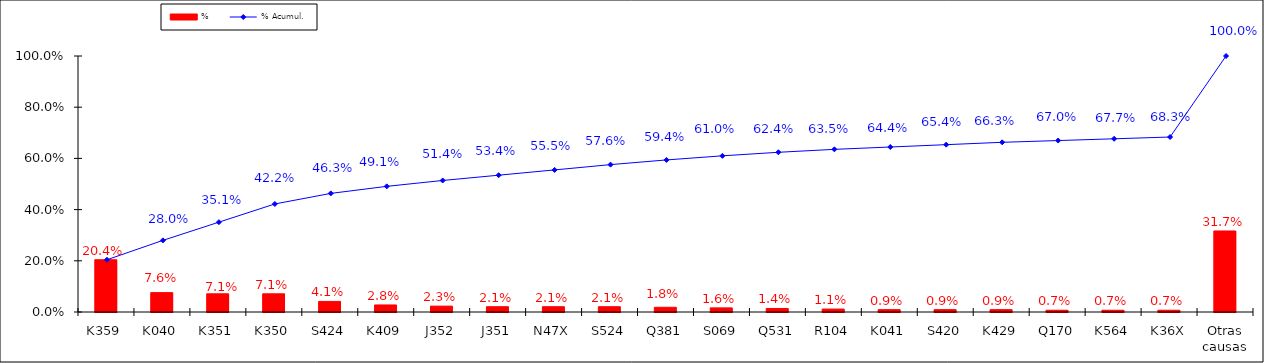
| Category | % |
|---|---|
| K359 | 0.204 |
| K040 | 0.076 |
| K351 | 0.071 |
| K350 | 0.071 |
| S424 | 0.041 |
| K409 | 0.028 |
| J352 | 0.023 |
| J351 | 0.021 |
| N47X | 0.021 |
| S524 | 0.021 |
| Q381 | 0.018 |
| S069 | 0.016 |
| Q531 | 0.014 |
| R104 | 0.011 |
| K041 | 0.009 |
| S420 | 0.009 |
| K429 | 0.009 |
| Q170 | 0.007 |
| K564 | 0.007 |
| K36X | 0.007 |
| Otras causas | 0.317 |